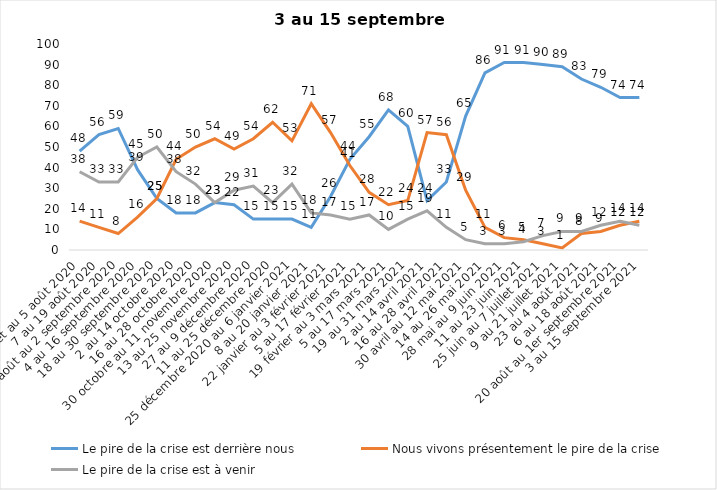
| Category | Le pire de la crise est derrière nous | Nous vivons présentement le pire de la crise | Le pire de la crise est à venir |
|---|---|---|---|
| 24 juillet au 5 août 2020 | 48 | 14 | 38 |
| 7 au 19 août 2020 | 56 | 11 | 33 |
| 21 août au 2 septembre 2020 | 59 | 8 | 33 |
| 4 au 16 septembre 2020 | 39 | 16 | 45 |
| 18 au 30 septembre 2020 | 25 | 25 | 50 |
| 2 au 14 octobre 2020 | 18 | 44 | 38 |
| 16 au 28 octobre 2020 | 18 | 50 | 32 |
| 30 octobre au 11 novembre 2020 | 23 | 54 | 23 |
| 13 au 25 novembre 2020 | 22 | 49 | 29 |
| 27 au 9 décembre 2020 | 15 | 54 | 31 |
| 11 au 25 décembre 2020 | 15 | 62 | 23 |
| 25 décembre 2020 au 6 janvier 2021 | 15 | 53 | 32 |
| 8 au 20 janvier 2021 | 11 | 71 | 18 |
| 22 janvier au 3 février 2021 | 26 | 57 | 17 |
| 5 au 17 février 2021 | 44 | 41 | 15 |
| 19 février au 3 mars 2021 | 55 | 28 | 17 |
| 5 au 17 mars 2021 | 68 | 22 | 10 |
| 19 au 31 mars 2021 | 60 | 24 | 15 |
| 2 au 14 avril 2021 | 24 | 57 | 19 |
| 16 au 28 avril 2021 | 33 | 56 | 11 |
| 30 avril au 12 mai 2021 | 65 | 29 | 5 |
| 14 au 26 mai 2021 | 86 | 11 | 3 |
| 28 mai au 9 juin 2021 | 91 | 6 | 3 |
| 11 au 23 juin 2021 | 91 | 5 | 4 |
| 25 juin au 7 juillet 2021 | 90 | 3 | 7 |
| 9 au 21 juillet 2021 | 89 | 1 | 9 |
| 23 au 4 août 2021 | 83 | 8 | 9 |
| 6 au 18 août 2021 | 79 | 9 | 12 |
| 20 août au 1er septembre 2021 | 74 | 12 | 14 |
| 3 au 15 septembre 2021 | 74 | 14 | 12 |